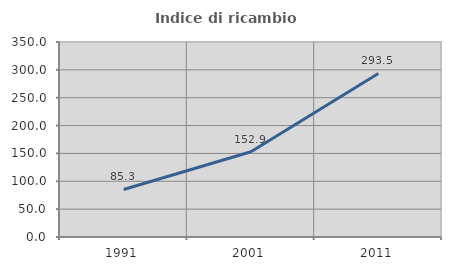
| Category | Indice di ricambio occupazionale  |
|---|---|
| 1991.0 | 85.276 |
| 2001.0 | 152.918 |
| 2011.0 | 293.529 |